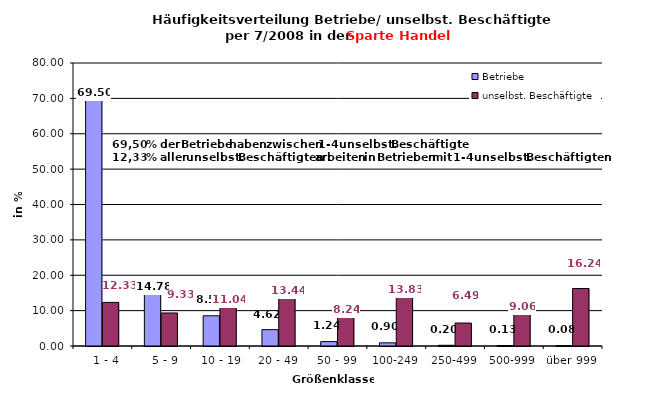
| Category | Betriebe | unselbst. Beschäftigte |
|---|---|---|
|   1 - 4 | 69.499 | 12.325 |
|   5 - 9 | 14.78 | 9.335 |
|  10 - 19 | 8.543 | 11.038 |
| 20 - 49 | 4.624 | 13.443 |
| 50 - 99 | 1.243 | 8.238 |
| 100-249 | 0.896 | 13.829 |
| 250-499 | 0.202 | 6.49 |
| 500-999 | 0.134 | 9.06 |
| über 999 | 0.078 | 16.242 |